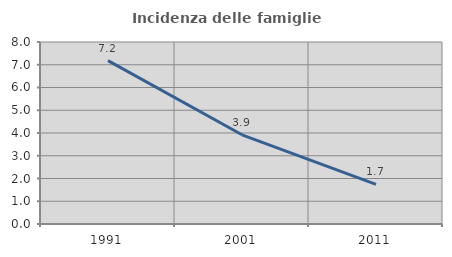
| Category | Incidenza delle famiglie numerose |
|---|---|
| 1991.0 | 7.181 |
| 2001.0 | 3.92 |
| 2011.0 | 1.742 |